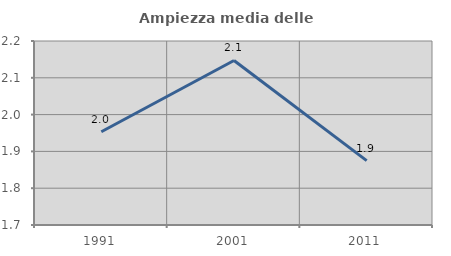
| Category | Ampiezza media delle famiglie |
|---|---|
| 1991.0 | 1.953 |
| 2001.0 | 2.147 |
| 2011.0 | 1.875 |